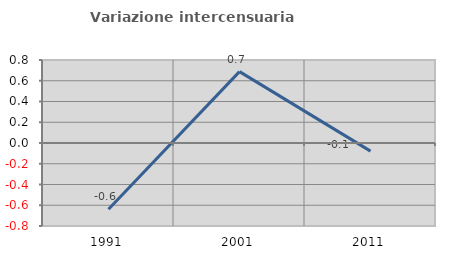
| Category | Variazione intercensuaria annua |
|---|---|
| 1991.0 | -0.639 |
| 2001.0 | 0.688 |
| 2011.0 | -0.078 |